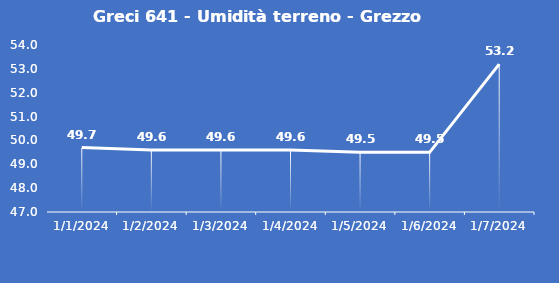
| Category | Greci 641 - Umidità terreno - Grezzo (%VWC) |
|---|---|
| 1/1/24 | 49.7 |
| 1/2/24 | 49.6 |
| 1/3/24 | 49.6 |
| 1/4/24 | 49.6 |
| 1/5/24 | 49.5 |
| 1/6/24 | 49.5 |
| 1/7/24 | 53.2 |